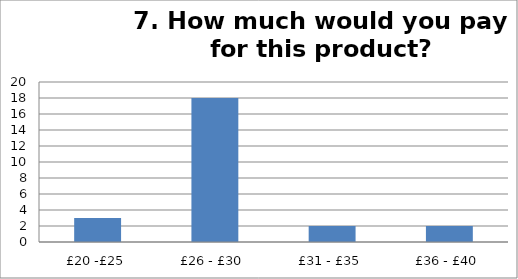
| Category | Series 0 |
|---|---|
| £20 -£25 | 3 |
| £26 - £30 | 18 |
| £31 - £35 | 2 |
| £36 - £40 | 2 |